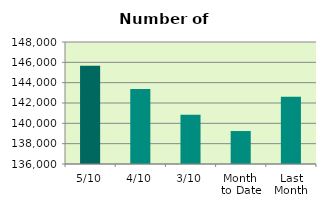
| Category | Series 0 |
|---|---|
| 5/10 | 145670 |
| 4/10 | 143372 |
| 3/10 | 140836 |
| Month 
to Date | 139242.8 |
| Last
Month | 142606.2 |